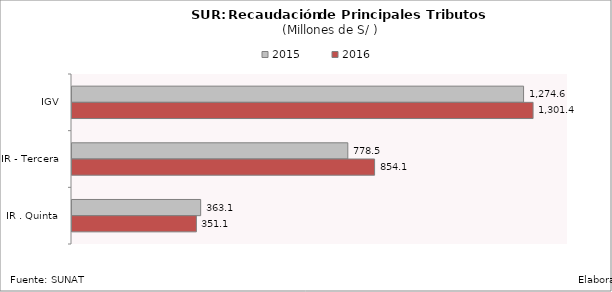
| Category | 2015 | 2016 |
|---|---|---|
| IGV | 1274.59 | 1301.409 |
| IR - Tercera | 778.507 | 854.083 |
| IR . Quinta | 363.149 | 351.063 |